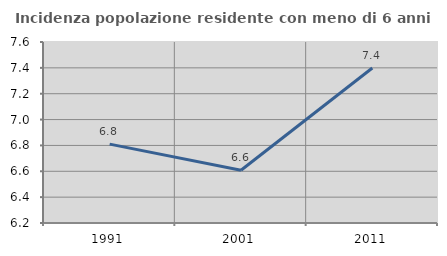
| Category | Incidenza popolazione residente con meno di 6 anni |
|---|---|
| 1991.0 | 6.81 |
| 2001.0 | 6.608 |
| 2011.0 | 7.399 |